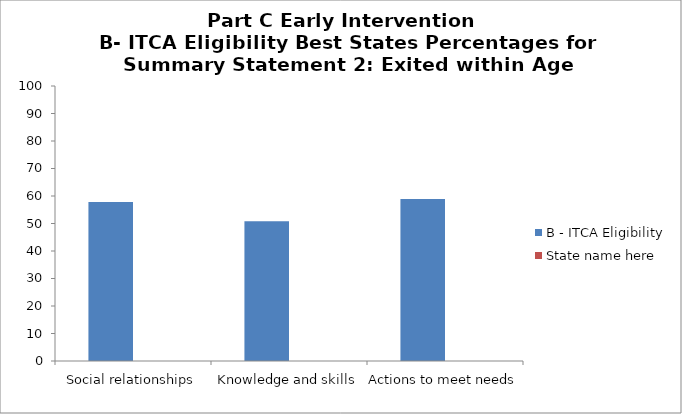
| Category | B - ITCA Eligibility | State name here |
|---|---|---|
| Social relationships | 57.8 |  |
| Knowledge and skills | 50.8 |  |
| Actions to meet needs | 58.9 |  |